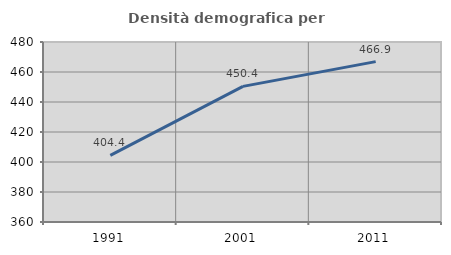
| Category | Densità demografica |
|---|---|
| 1991.0 | 404.427 |
| 2001.0 | 450.427 |
| 2011.0 | 466.926 |